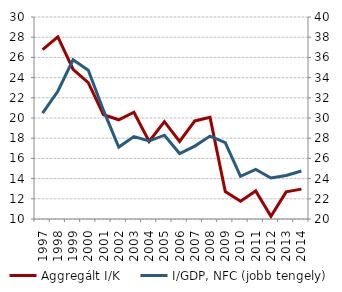
| Category | Aggregált I/K |
|---|---|
| 1997.0 | 26.769 |
| 1998.0 | 28.041 |
| 1999.0 | 24.826 |
| 2000.0 | 23.505 |
| 2001.0 | 20.329 |
| 2002.0 | 19.825 |
| 2003.0 | 20.569 |
| 2004.0 | 17.678 |
| 2005.0 | 19.638 |
| 2006.0 | 17.677 |
| 2007.0 | 19.712 |
| 2008.0 | 20.06 |
| 2009.0 | 12.712 |
| 2010.0 | 11.757 |
| 2011.0 | 12.773 |
| 2012.0 | 10.262 |
| 2013.0 | 12.684 |
| 2014.0 | 12.956 |